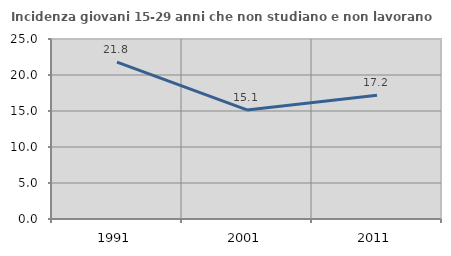
| Category | Incidenza giovani 15-29 anni che non studiano e non lavorano  |
|---|---|
| 1991.0 | 21.776 |
| 2001.0 | 15.145 |
| 2011.0 | 17.184 |